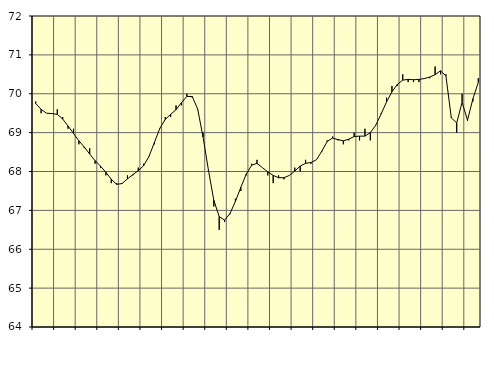
| Category | Piggar | Series 1 |
|---|---|---|
| nan | 69.8 | 69.75 |
| 1.0 | 69.5 | 69.6 |
| 1.0 | 69.5 | 69.5 |
| 1.0 | 69.5 | 69.49 |
| nan | 69.6 | 69.47 |
| 2.0 | 69.4 | 69.35 |
| 2.0 | 69.1 | 69.17 |
| 2.0 | 69.1 | 68.98 |
| nan | 68.7 | 68.79 |
| 3.0 | 68.6 | 68.63 |
| 3.0 | 68.6 | 68.45 |
| 3.0 | 68.2 | 68.28 |
| nan | 68.1 | 68.14 |
| 4.0 | 67.9 | 67.98 |
| 4.0 | 67.7 | 67.8 |
| 4.0 | 67.7 | 67.67 |
| nan | 67.7 | 67.69 |
| 5.0 | 67.9 | 67.81 |
| 5.0 | 67.9 | 67.92 |
| 5.0 | 68.1 | 68.02 |
| nan | 68.2 | 68.15 |
| 6.0 | 68.4 | 68.39 |
| 6.0 | 68.7 | 68.75 |
| 6.0 | 69.1 | 69.11 |
| nan | 69.4 | 69.34 |
| 7.0 | 69.4 | 69.47 |
| 7.0 | 69.7 | 69.59 |
| 7.0 | 69.7 | 69.77 |
| nan | 70 | 69.93 |
| 8.0 | 69.9 | 69.93 |
| 8.0 | 69.6 | 69.61 |
| 8.0 | 69 | 68.89 |
| nan | 68 | 68.04 |
| 9.0 | 67.1 | 67.26 |
| 9.0 | 66.5 | 66.84 |
| 9.0 | 66.7 | 66.75 |
| nan | 66.9 | 66.92 |
| 10.0 | 67.3 | 67.23 |
| 10.0 | 67.5 | 67.59 |
| 10.0 | 67.9 | 67.93 |
| nan | 68.2 | 68.16 |
| 11.0 | 68.3 | 68.21 |
| 11.0 | 68.1 | 68.1 |
| 11.0 | 67.9 | 67.99 |
| nan | 67.7 | 67.9 |
| 12.0 | 67.9 | 67.84 |
| 12.0 | 67.8 | 67.84 |
| 12.0 | 67.9 | 67.9 |
| nan | 68.1 | 68.01 |
| 13.0 | 68 | 68.14 |
| 13.0 | 68.3 | 68.21 |
| 13.0 | 68.2 | 68.23 |
| nan | 68.3 | 68.3 |
| 14.0 | 68.5 | 68.52 |
| 14.0 | 68.8 | 68.77 |
| 14.0 | 68.9 | 68.86 |
| nan | 68.8 | 68.82 |
| 15.0 | 68.7 | 68.79 |
| 15.0 | 68.8 | 68.83 |
| 15.0 | 69 | 68.9 |
| nan | 68.8 | 68.91 |
| 16.0 | 69.1 | 68.91 |
| 16.0 | 68.8 | 69 |
| 16.0 | 69.2 | 69.19 |
| nan | 69.5 | 69.48 |
| 17.0 | 69.9 | 69.79 |
| 17.0 | 70.2 | 70.05 |
| 17.0 | 70.2 | 70.24 |
| nan | 70.5 | 70.35 |
| 18.0 | 70.3 | 70.37 |
| 18.0 | 70.3 | 70.36 |
| 18.0 | 70.3 | 70.37 |
| nan | 70.4 | 70.39 |
| 19.0 | 70.4 | 70.43 |
| 19.0 | 70.7 | 70.49 |
| 19.0 | 70.5 | 70.59 |
| nan | 70.5 | 70.46 |
| 20.0 | 69.4 | 69.38 |
| 20.0 | 69 | 69.25 |
| 20.0 | 70 | 69.78 |
| nan | 69.3 | 69.32 |
| 21.0 | 69.8 | 69.87 |
| 21.0 | 70.4 | 70.29 |